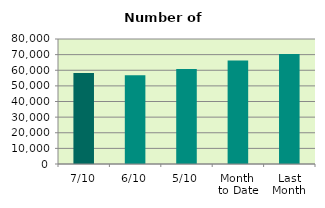
| Category | Series 0 |
|---|---|
| 7/10 | 58290 |
| 6/10 | 56866 |
| 5/10 | 60736 |
| Month 
to Date | 66282.4 |
| Last
Month | 70459.909 |